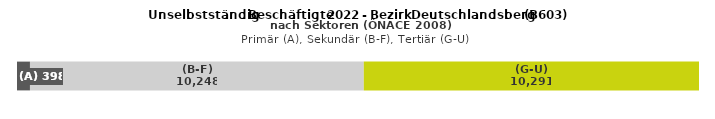
| Category | (A) | (B-F) | (G-U) |
|---|---|---|---|
| 0 | 398 | 10248 | 10291 |